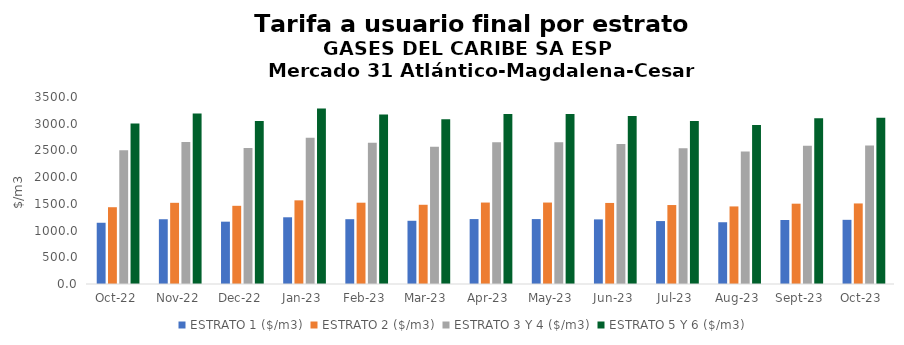
| Category | ESTRATO 1 ($/m3) | ESTRATO 2 ($/m3) | ESTRATO 3 Y 4 ($/m3) | ESTRATO 5 Y 6 ($/m3) |
|---|---|---|---|---|
| 2022-10-01 | 1146.18 | 1437.12 | 2503.54 | 3004.248 |
| 2022-11-01 | 1212.06 | 1519.44 | 2658.31 | 3189.972 |
| 2022-12-01 | 1166.58 | 1463.43 | 2544.24 | 3053.088 |
| 2023-01-01 | 1248.7 | 1565.89 | 2736.03 | 3283.236 |
| 2023-02-01 | 1212.89 | 1521.57 | 2641.83 | 3170.196 |
| 2023-03-01 | 1183.19 | 1482.78 | 2568.94 | 3082.728 |
| 2023-04-01 | 1215.25 | 1524.46 | 2651.33 | 3181.596 |
| 2023-05-01 | 1215.25 | 1524.46 | 2651.33 | 3181.596 |
| 2023-06-01 | 1209.41 | 1517.12 | 2619.03 | 3142.836 |
| 2023-07-01 | 1178 | 1477.97 | 2542.18 | 3050.616 |
| 2023-08-01 | 1155.93 | 1451.92 | 2479.28 | 2975.136 |
| 2023-09-01 | 1198 | 1503.27 | 2586.8 | 3104.16 |
| 2023-10-01 | 1201.13 | 1507.69 | 2594.42 | 3113.304 |